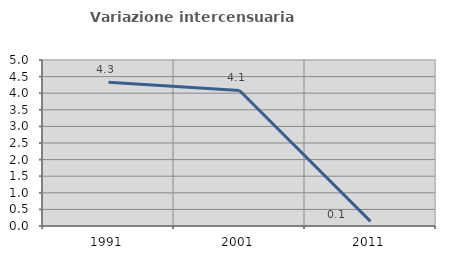
| Category | Variazione intercensuaria annua |
|---|---|
| 1991.0 | 4.329 |
| 2001.0 | 4.081 |
| 2011.0 | 0.141 |